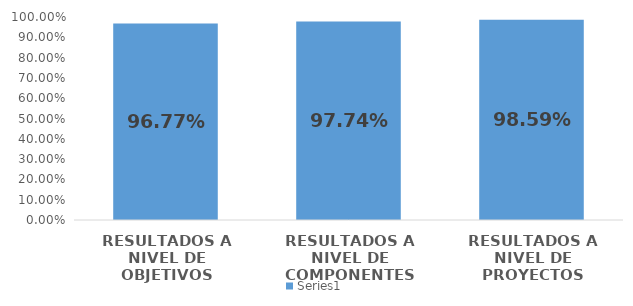
| Category | Series 0 |
|---|---|
| RESULTADOS A NIVEL DE OBJETIVOS | 0.968 |
| RESULTADOS A NIVEL DE COMPONENTES | 0.977 |
| RESULTADOS A NIVEL DE PROYECTOS | 0.986 |